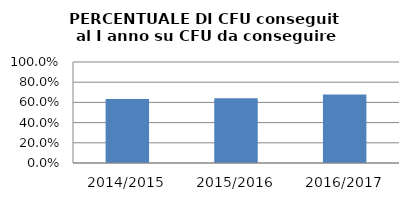
| Category | 2014/2015 2015/2016 2016/2017 |
|---|---|
| 2014/2015 | 0.634 |
| 2015/2016 | 0.642 |
| 2016/2017 | 0.679 |